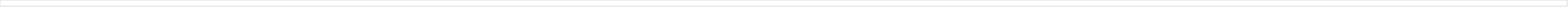
| Category | Series 0 |
|---|---|
| 1 | 0.667 |
| 2 | 0.524 |
| 3 | 0.286 |
| 4 | 0.429 |
| 5 | 0.619 |
| 6 | 0.333 |
| 7 | 0 |
| #ССЫЛКА! | 0 |
| 10. | 0.714 |
| #ССЫЛКА! | 0 |
| 13 | 0.333 |
| #ССЫЛКА! | 0 |
| 16. | 0.667 |
| 17 | 0.429 |
| 18 | 0.238 |
| 19 | 0.714 |
| 20 | 0.429 |
| 21 | 0.381 |
| 22 | 0.857 |
| 23 | 0.429 |
| 24 | 0.524 |
| 25 | 0.381 |
| 26 | 0.571 |
| 27 | 0.762 |
| 28 | 0.143 |
| 29 | 0.381 |
| 30 | 0.333 |
| 31 | 0.714 |
| 32 | 0.524 |
| #ССЫЛКА! | 0 |
| 0 | 0 |
| 0 | 0 |
| 0 | 0 |
| 0 | 0 |
| 0 | 0 |